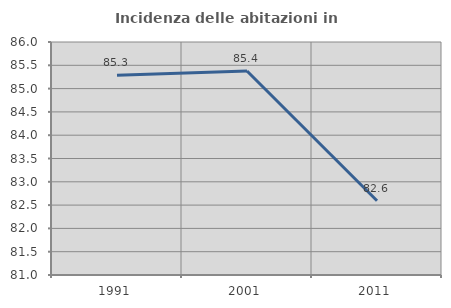
| Category | Incidenza delle abitazioni in proprietà  |
|---|---|
| 1991.0 | 85.285 |
| 2001.0 | 85.378 |
| 2011.0 | 82.594 |